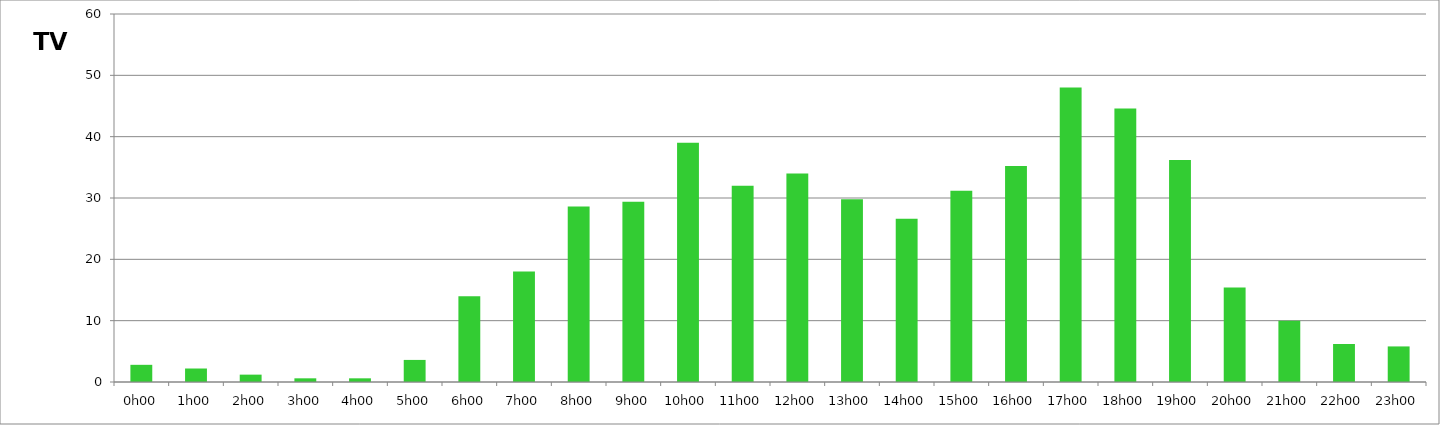
| Category | TV |
|---|---|
| 0.0 | 2.8 |
| 0.041666666666666664 | 2.2 |
| 0.08333333333333333 | 1.2 |
| 0.125 | 0.6 |
| 0.16666666666666666 | 0.6 |
| 0.20833333333333334 | 3.6 |
| 0.25 | 14 |
| 0.2916666666666667 | 18 |
| 0.3333333333333333 | 28.6 |
| 0.375 | 29.4 |
| 0.4166666666666667 | 39 |
| 0.4583333333333333 | 32 |
| 0.5 | 34 |
| 0.5416666666666666 | 29.8 |
| 0.5833333333333334 | 26.6 |
| 0.625 | 31.2 |
| 0.6666666666666666 | 35.2 |
| 0.7083333333333334 | 48 |
| 0.75 | 44.6 |
| 0.7916666666666666 | 36.2 |
| 0.8333333333333334 | 15.4 |
| 0.875 | 10 |
| 0.9166666666666666 | 6.2 |
| 0.9583333333333334 | 5.8 |